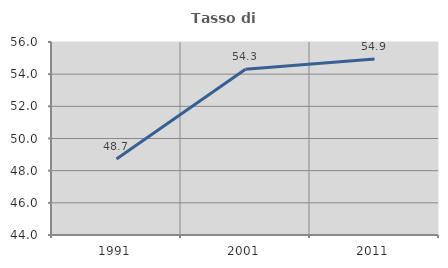
| Category | Tasso di occupazione   |
|---|---|
| 1991.0 | 48.723 |
| 2001.0 | 54.309 |
| 2011.0 | 54.939 |